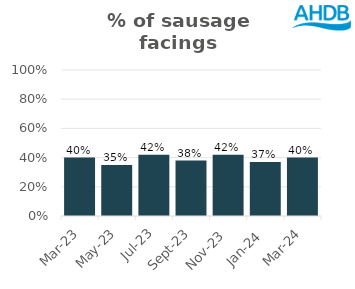
| Category | Sausage |
|---|---|
| 2023-03-01 | 0.4 |
| 2023-05-01 | 0.35 |
| 2023-07-01 | 0.42 |
| 2023-09-01 | 0.38 |
| 2023-11-01 | 0.42 |
| 2024-01-01 | 0.37 |
| 2024-03-01 | 0.4 |